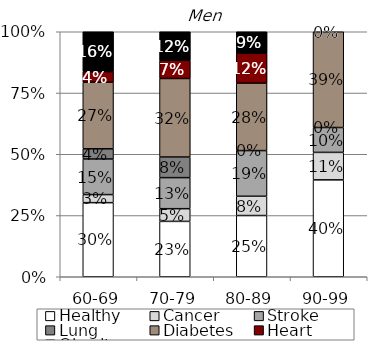
| Category | Healthy | Cancer | Stroke | Lung | Diabetes | Heart | Obesity |
|---|---|---|---|---|---|---|---|
| 60-69 | 0.302 | 0.033 | 0.145 | 0.042 | 0.272 | 0.043 | 0.163 |
| 70-79 | 0.226 | 0.052 | 0.127 | 0.084 | 0.321 | 0.074 | 0.117 |
| 80-89 | 0.25 | 0.079 | 0.186 | 0 | 0.275 | 0.122 | 0.087 |
| 90-99 | 0.395 | 0.112 | 0.102 | 0 | 0.391 | 0 | 0 |